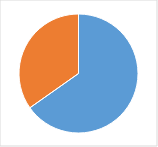
| Category | Series 0 |
|---|---|
| 0 | 0.643 |
| 1 | 0.343 |
| 2 | 0 |